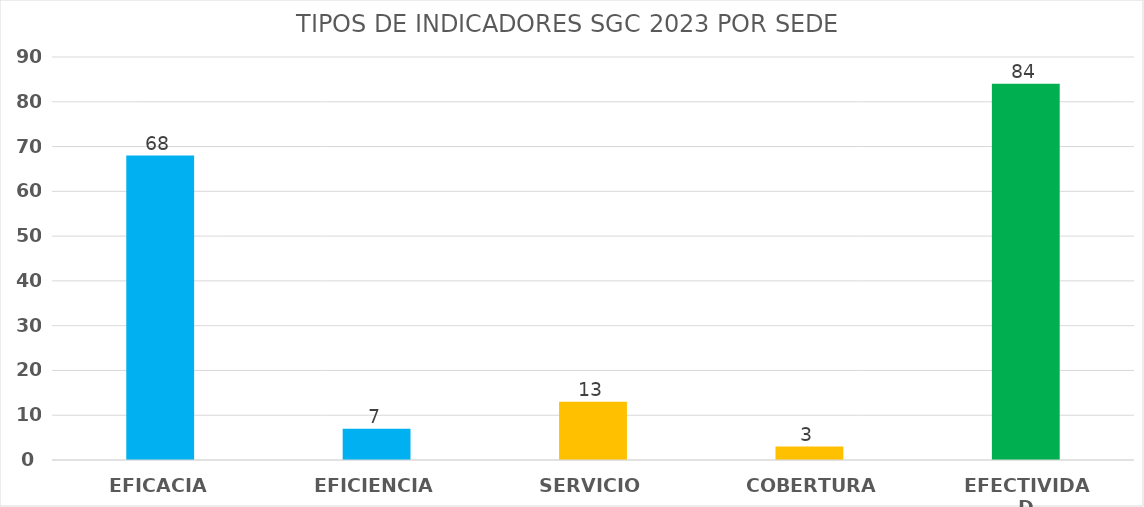
| Category | Series 0 |
|---|---|
| EFICACIA | 68 |
| EFICIENCIA | 7 |
| SERVICIO | 13 |
| COBERTURA | 3 |
| EFECTIVIDAD | 84 |